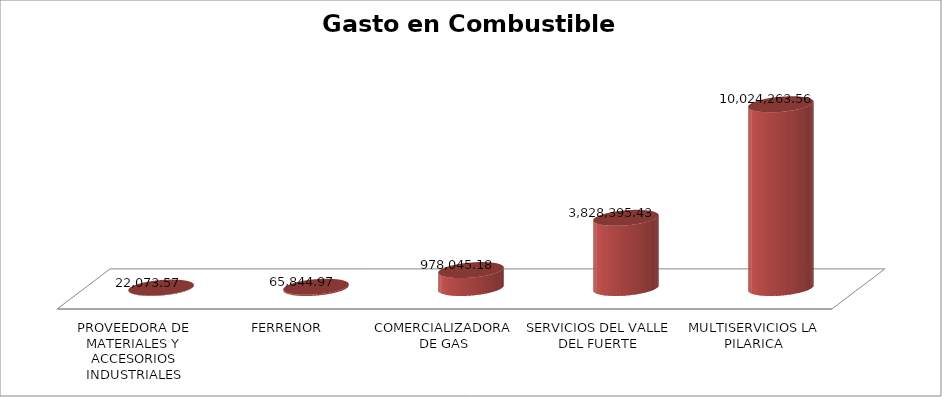
| Category | Suma |
|---|---|
| PROVEEDORA DE MATERIALES Y ACCESORIOS INDUSTRIALES | 22073.57 |
| FERRENOR | 65844.97 |
| COMERCIALIZADORA DE GAS | 978045.18 |
| SERVICIOS DEL VALLE DEL FUERTE | 3828395.43 |
| MULTISERVICIOS LA PILARICA | 10024263.56 |